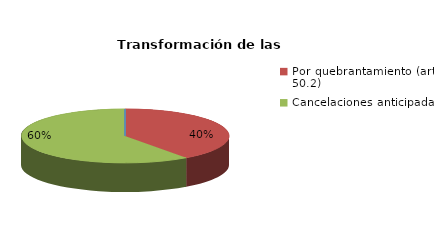
| Category | Series 0 |
|---|---|
| Reducciones y sustituciones (arts. 13 y 51) | 0 |
| Por quebrantamiento (art. 50.2) | 8 |
| Cancelaciones anticipadas | 12 |
| Traslado a Centros Penitenciarios | 0 |
| Conversión internamientos en cerrados (art. 51.2) | 0 |